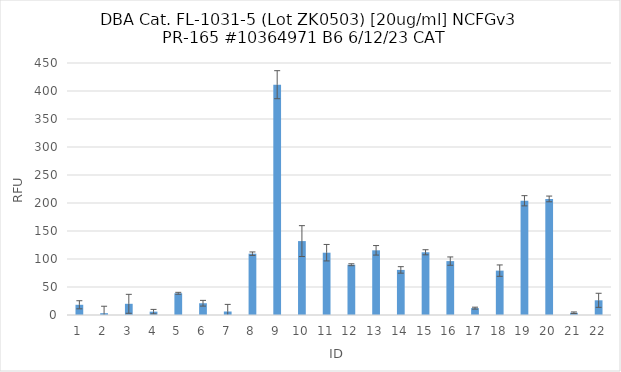
| Category | RFU |
|---|---|
| 0 | 18.25 |
| 1 | 3.25 |
| 2 | 20 |
| 3 | 6 |
| 4 | 38.75 |
| 5 | 21 |
| 6 | 6.25 |
| 7 | 109.5 |
| 8 | 411.25 |
| 9 | 132 |
| 10 | 111.25 |
| 11 | 89.75 |
| 12 | 115.5 |
| 13 | 80.5 |
| 14 | 112 |
| 15 | 96.25 |
| 16 | 12.25 |
| 17 | 79.25 |
| 18 | 204 |
| 19 | 207.25 |
| 20 | 4 |
| 21 | 26.25 |